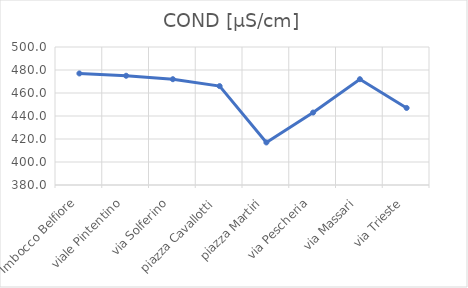
| Category | COND [µS/cm] |
|---|---|
| Imbocco Belfiore | 477 |
| viale Pintentino | 475 |
| via Solferino | 472 |
| piazza Cavallotti | 466 |
| piazza Martiri | 417 |
| via Pescheria | 443 |
| via Massari | 472 |
| via Trieste | 447 |